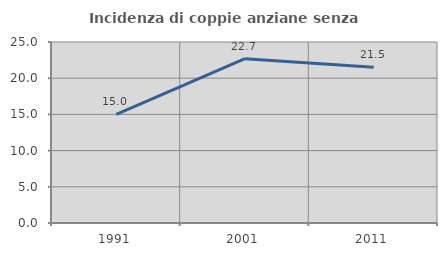
| Category | Incidenza di coppie anziane senza figli  |
|---|---|
| 1991.0 | 15.007 |
| 2001.0 | 22.69 |
| 2011.0 | 21.501 |